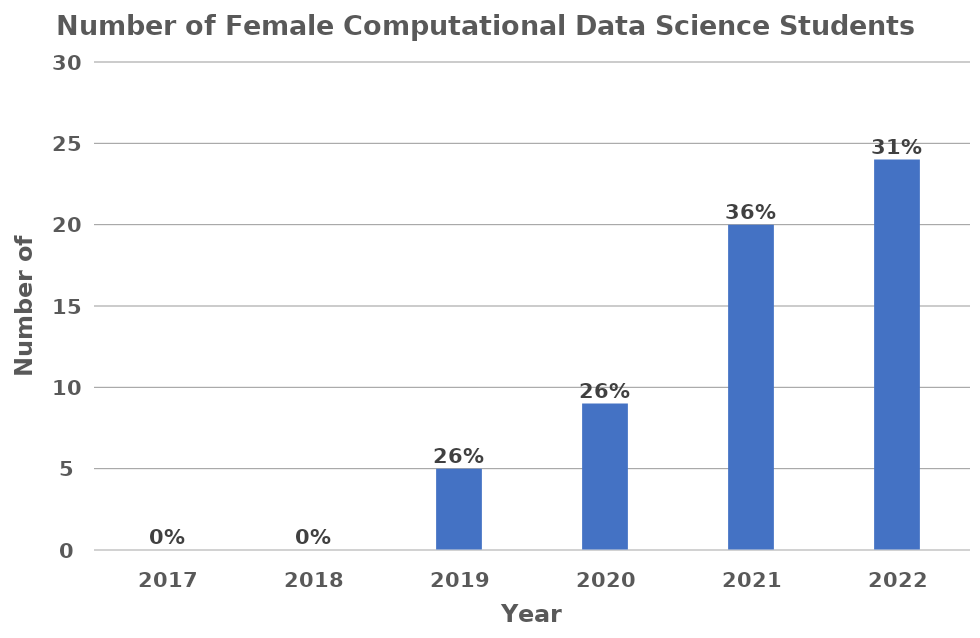
| Category | Number of Female Computational Data Science Students |
|---|---|
| 2017.0 | 0 |
| 2018.0 | 0 |
| 2019.0 | 5 |
| 2020.0 | 9 |
| 2021.0 | 20 |
| 2022.0 | 24 |